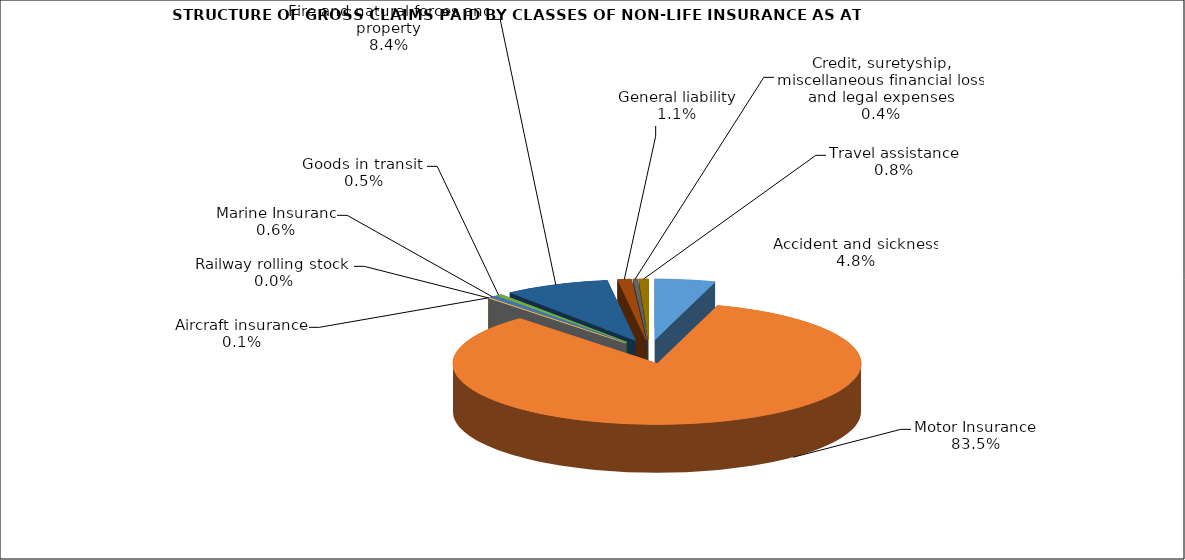
| Category | Accident and sickness |
|---|---|
| Accident and sickness | 0.048 |
| Motor Insurance | 0.835 |
| Railway rolling stock  | 0 |
| Aircraft insurance | 0.001 |
| Marine Insuranc | 0.006 |
| Goods in transit  | 0.005 |
| Fire and natural forces and property | 0.084 |
| General liability | 0.011 |
| Credit, suretyship, miscellaneous financial loss and legal expenses | 0.004 |
| Travel assistance | 0.008 |